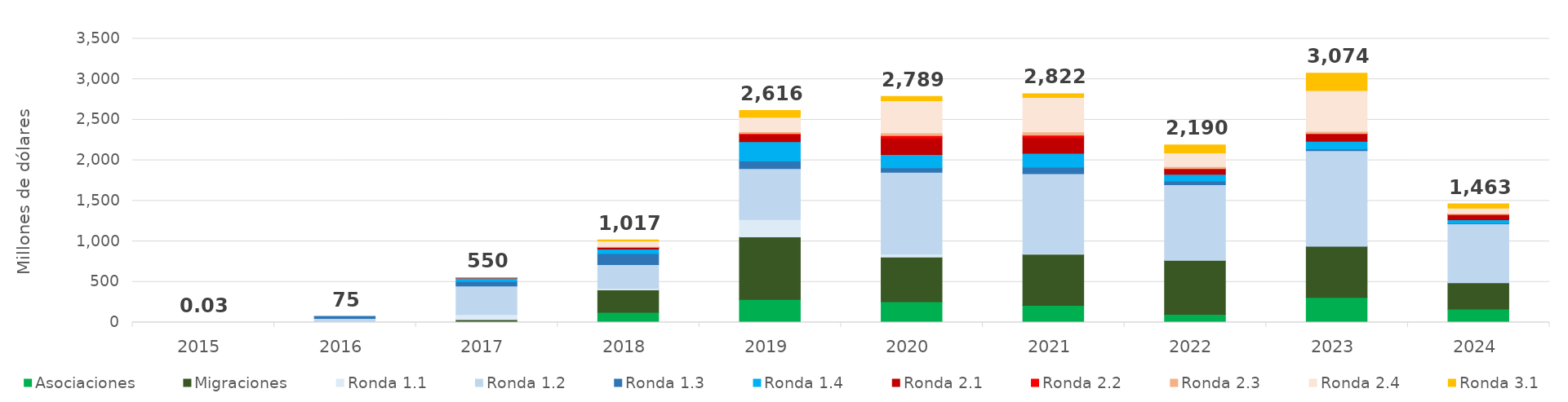
| Category | Asociaciones | Migraciones | Ronda 1.1 | Ronda 1.2 | Ronda 1.3 | Ronda 1.4 | Ronda 2.1 | Ronda 2.2 | Ronda 2.3 | Ronda 2.4 | Ronda 3.1 |
|---|---|---|---|---|---|---|---|---|---|---|---|
| 2015.0 | 0 | 0 | 0.023 | 0.003 | 0 | 0 | 0 | 0 | 0 | 0 | 0 |
| 2016.0 | 0 | 0 | 7.936 | 41.333 | 25.282 | 0 | 0 | 0 | 0 | 0 | 0 |
| 2017.0 | 2.542 | 33.018 | 63.397 | 349.863 | 56.94 | 42.788 | 0.983 | 0.059 | 0.096 | 0 | 0 |
| 2018.0 | 125.867 | 276.816 | 16.108 | 294.863 | 135.1 | 55.228 | 21.392 | 2.843 | 10.748 | 66.3 | 11.883 |
| 2019.0 | 283.572 | 772.876 | 213.402 | 628.348 | 92.772 | 239.73 | 87.584 | 13.102 | 21.34 | 178.948 | 83.95 |
| 2020.0 | 257.541 | 550.523 | 34.013 | 1011.433 | 55.889 | 161.565 | 200.141 | 33.971 | 33.561 | 396.842 | 53.073 |
| 2021.0 | 210.348 | 631.613 | 8.662 | 983.846 | 81.954 | 170.902 | 191.437 | 32.428 | 39.079 | 425.153 | 46.21 |
| 2022.0 | 100.478 | 669.774 | 0.096 | 930.188 | 44.312 | 81.891 | 69.333 | 2.33 | 24.094 | 170.079 | 97.522 |
| 2023.0 | 309.546 | 630.228 | 0 | 1179.242 | 20.961 | 95.246 | 95.213 | 1.179 | 25.955 | 503.583 | 212.89 |
| 2024.0 | 166.619 | 324.906 | 0 | 725.709 | 6.209 | 43.397 | 64.283 | 2.686 | 12.457 | 63.675 | 52.795 |